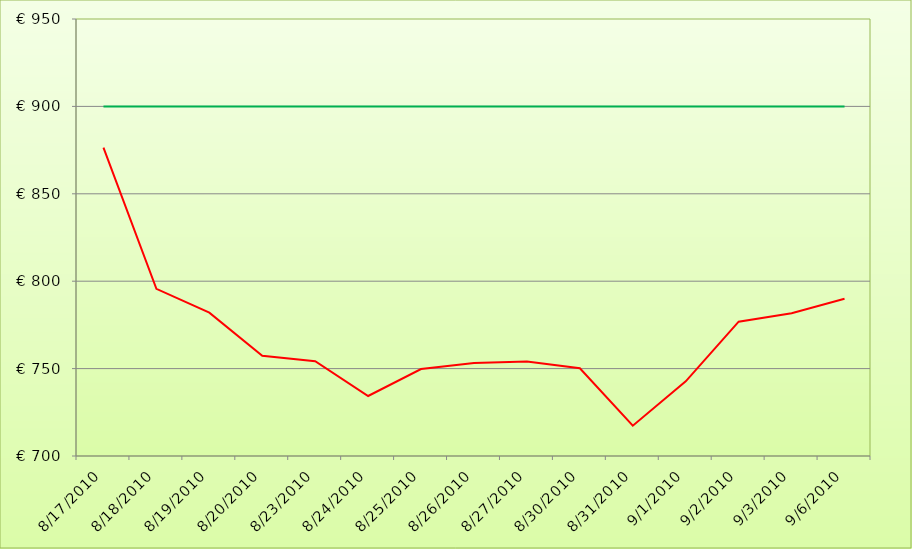
| Category | Waarde | Eigen vermogen |
|---|---|---|
| 2010-08-17 | 876.43 | 900 |
| 2010-08-18 | 795.63 | 900 |
| 2010-08-19 | 782.03 | 900 |
| 2010-08-20 | 757.33 | 900 |
| 2010-08-23 | 754.23 | 900 |
| 2010-08-24 | 734.33 | 900 |
| 2010-08-25 | 749.73 | 900 |
| 2010-08-26 | 753.23 | 900 |
| 2010-08-27 | 754.03 | 900 |
| 2010-08-30 | 750.23 | 900 |
| 2010-08-31 | 717.33 | 900 |
| 2010-09-01 | 742.73 | 900 |
| 2010-09-02 | 776.83 | 900 |
| 2010-09-03 | 781.63 | 900 |
| 2010-09-06 | 790 | 900 |